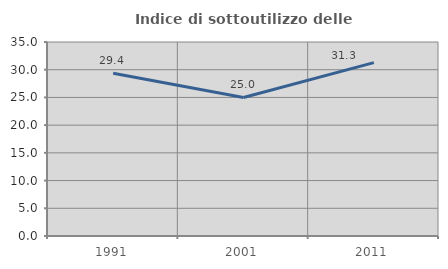
| Category | Indice di sottoutilizzo delle abitazioni  |
|---|---|
| 1991.0 | 29.371 |
| 2001.0 | 25 |
| 2011.0 | 31.273 |